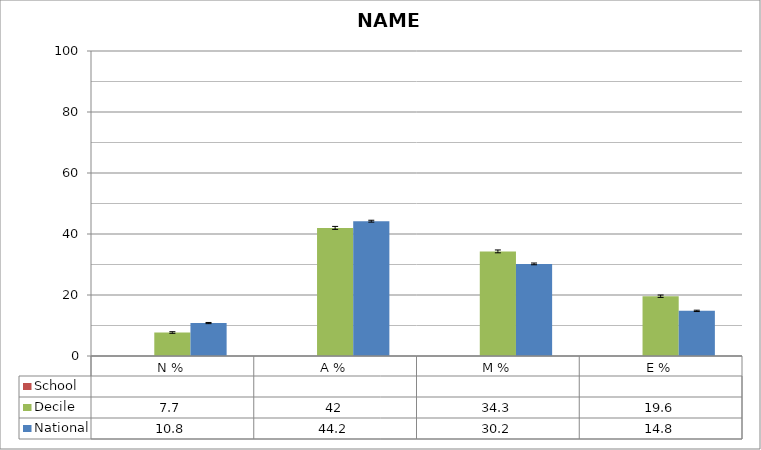
| Category | School  | Decile | National |
|---|---|---|---|
| N % |  | 7.7 | 10.8 |
| A % |  | 42 | 44.2 |
| M % |  | 34.3 | 30.2 |
| E % |  | 19.6 | 14.8 |